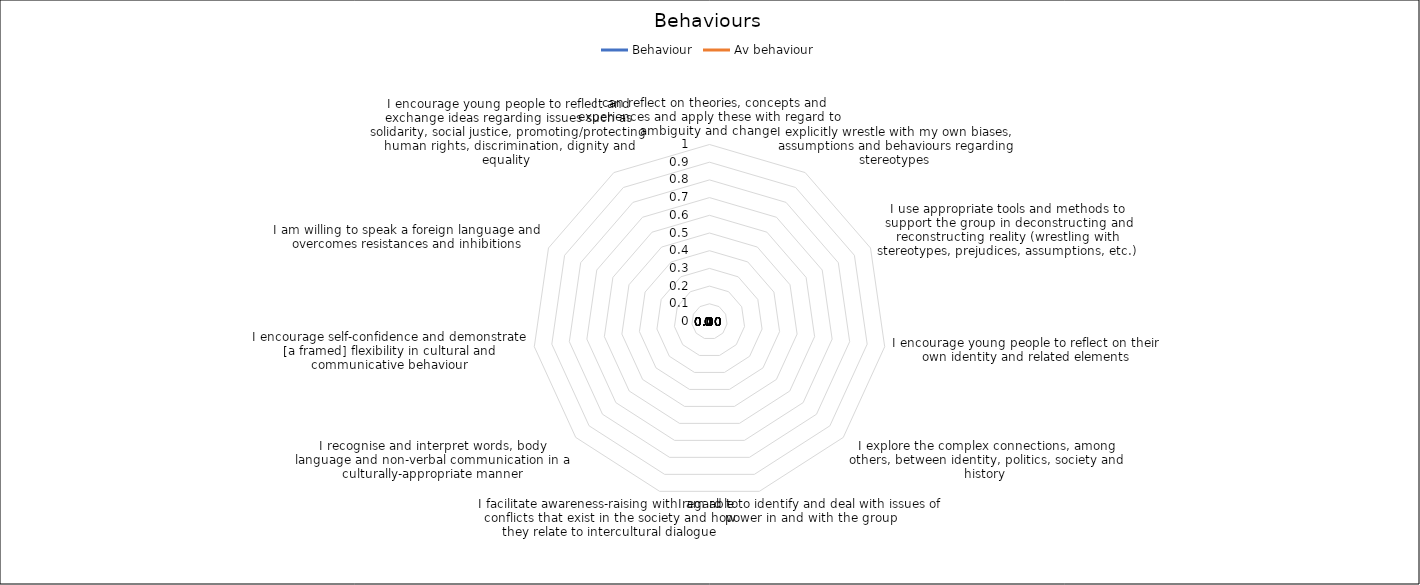
| Category | Behaviour | Av behaviour |
|---|---|---|
| I can reflect on theories, concepts and experiences and apply these with regard to ambiguity and change  | 0 | 0 |
| I explicitly wrestle with my own biases, assumptions and behaviours regarding stereotypes | 0 | 0 |
| I use appropriate tools and methods to support the group in deconstructing and reconstructing reality (wrestling with stereotypes, prejudices, assumptions, etc.) | 0 | 0 |
| I encourage young people to reflect on their own identity and related elements | 0 | 0 |
| I explore the complex connections, among others, between identity, politics, society and history  | 0 | 0 |
| I am able to identify and deal with issues of power in and with the group | 0 | 0 |
| I facilitate awareness-raising with regard to conflicts that exist in the society and how they relate to intercultural dialogue | 0 | 0 |
| I recognise and interpret words, body language and non-verbal communication in a culturally-appropriate manner | 0 | 0 |
| I encourage self-confidence and demonstrate [a framed] flexibility in cultural and communicative behaviour | 0 | 0 |
| I am willing to speak a foreign language and overcomes resistances and inhibitions | 0 | 0 |
| I encourage young people to reflect and exchange ideas regarding issues such as solidarity, social justice, promoting/protecting human rights, discrimination, dignity and equality  | 0 | 0 |